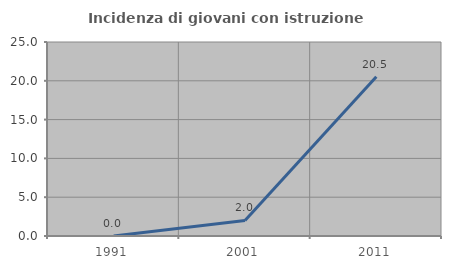
| Category | Incidenza di giovani con istruzione universitaria |
|---|---|
| 1991.0 | 0 |
| 2001.0 | 2 |
| 2011.0 | 20.513 |